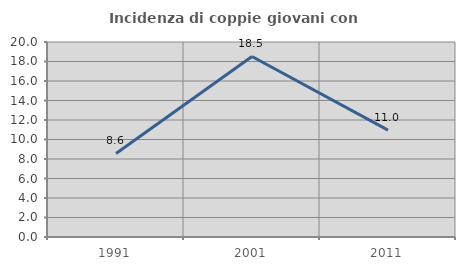
| Category | Incidenza di coppie giovani con figli |
|---|---|
| 1991.0 | 8.571 |
| 2001.0 | 18.519 |
| 2011.0 | 10.959 |